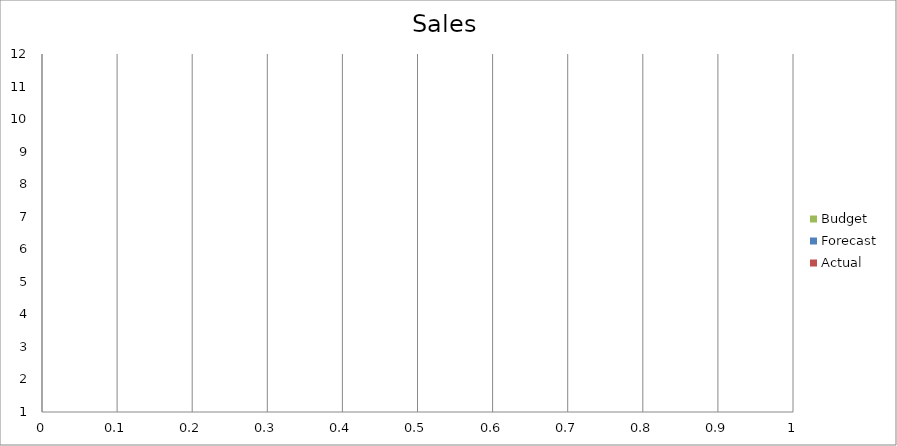
| Category | Budget | Forecast | Actual |
|---|---|---|---|
| 0 | 2620 | 3320 | 2580 |
| 1 | 3290 | 3330 | 2350 |
| 2 | 2730 | 520 | 2760 |
| 3 | 730 | 1810 | 3040 |
| 4 | 830 | 2630 | 1180 |
| 5 | 2740 | 3000 | 550 |
| 6 | 850 | 3180 | 660 |
| 7 | 2830 | 2510 | 3290 |
| 8 | 2190 | 1340 | 630 |
| 9 | 3070 | 2150 | 3410 |
| 10 | 3280 | 1120 | 2930 |
| 11 | 1600 | 2130 | 1130 |